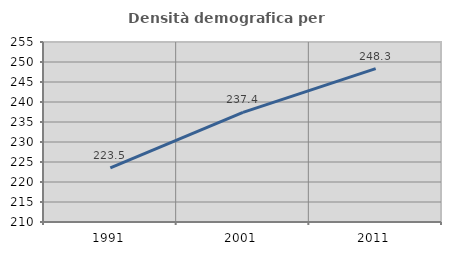
| Category | Densità demografica |
|---|---|
| 1991.0 | 223.543 |
| 2001.0 | 237.418 |
| 2011.0 | 248.336 |